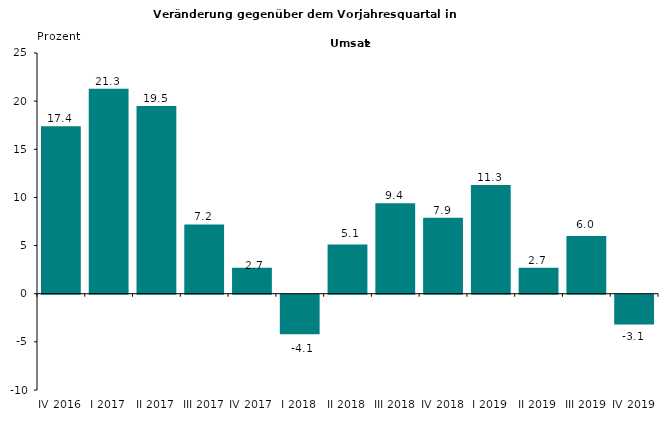
| Category | 17,4 |
|---|---|
| IV 2016 | 17.4 |
| I 2017 | 21.3 |
| II 2017 | 19.5 |
| III 2017 | 7.2 |
| IV 2017 | 2.7 |
| I 2018 | -4.1 |
| II 2018 | 5.1 |
| III 2018 | 9.4 |
| IV 2018 | 7.9 |
| I 2019 | 11.3 |
| II 2019 | 2.7 |
| III 2019 | 6 |
| IV 2019 | -3.1 |